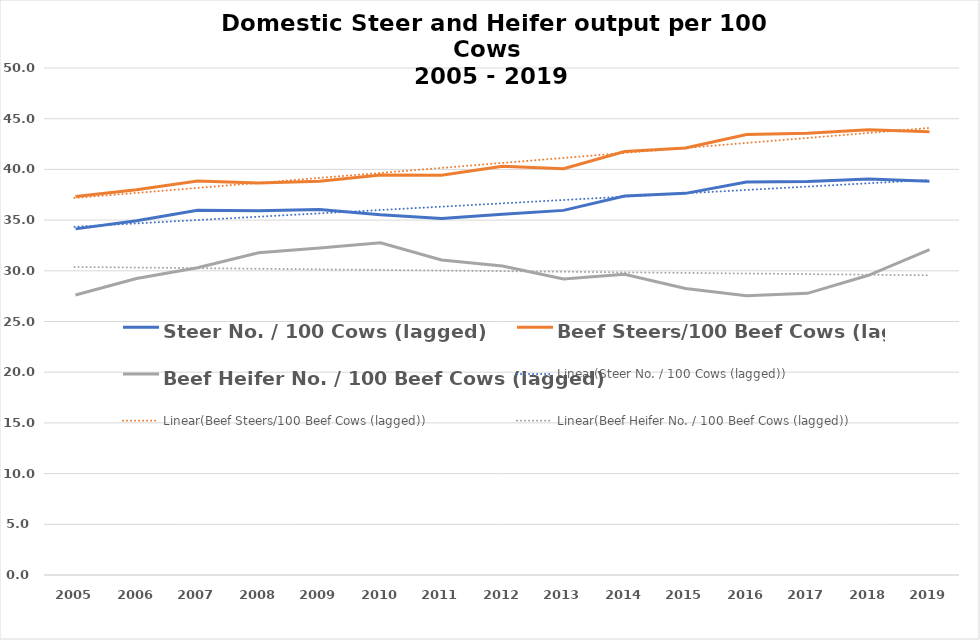
| Category | Steer No. / 100 Cows (lagged) | Beef Steers/100 Beef Cows (lagged) | Beef Heifer No. / 100 Beef Cows (lagged) |
|---|---|---|---|
| 2005.0 | 34.134 | 37.331 | 27.607 |
| 2006.0 | 34.942 | 37.995 | 29.245 |
| 2007.0 | 35.979 | 38.863 | 30.307 |
| 2008.0 | 35.929 | 38.67 | 31.779 |
| 2009.0 | 36.051 | 38.838 | 32.245 |
| 2010.0 | 35.523 | 39.436 | 32.759 |
| 2011.0 | 35.16 | 39.431 | 31.06 |
| 2012.0 | 35.586 | 40.304 | 30.471 |
| 2013.0 | 35.958 | 40.061 | 29.189 |
| 2014.0 | 37.377 | 41.772 | 29.65 |
| 2015.0 | 37.638 | 42.114 | 28.253 |
| 2016.0 | 38.763 | 43.447 | 27.543 |
| 2017.0 | 38.802 | 43.576 | 27.774 |
| 2018.0 | 39.06 | 43.919 | 29.556 |
| 2019.0 | 38.83 | 43.705 | 32.086 |